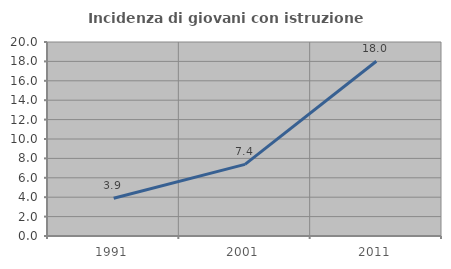
| Category | Incidenza di giovani con istruzione universitaria |
|---|---|
| 1991.0 | 3.886 |
| 2001.0 | 7.388 |
| 2011.0 | 18.018 |